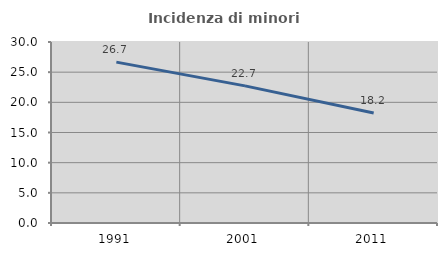
| Category | Incidenza di minori stranieri |
|---|---|
| 1991.0 | 26.667 |
| 2001.0 | 22.727 |
| 2011.0 | 18.222 |